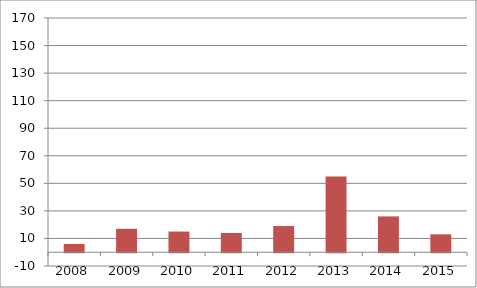
| Category | Series 1 |
|---|---|
| 0 | 6 |
| 1 | 17 |
| 2 | 15 |
| 3 | 14 |
| 4 | 19 |
| 5 | 55 |
| 6 | 26 |
| 7 | 13 |